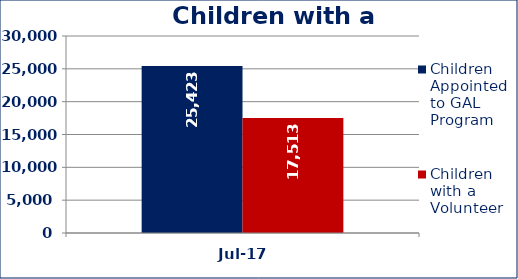
| Category | Children Appointed to GAL Program  | Children with a Volunteer  |
|---|---|---|
| Jul-17 | 25423 | 17513 |